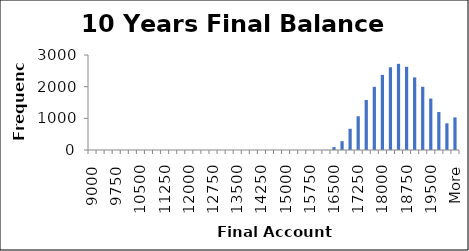
| Category | Frequency |
|---|---|
| 9000.0 | 0 |
| 9250.0 | 0 |
| 9500.0 | 0 |
| 9750.0 | 0 |
| 10000.0 | 0 |
| 10250.0 | 0 |
| 10500.0 | 0 |
| 10750.0 | 0 |
| 11000.0 | 0 |
| 11250.0 | 0 |
| 11500.0 | 0 |
| 11750.0 | 0 |
| 12000.0 | 0 |
| 12250.0 | 0 |
| 12500.0 | 0 |
| 12750.0 | 0 |
| 13000.0 | 0 |
| 13250.0 | 0 |
| 13500.0 | 0 |
| 13750.0 | 0 |
| 14000.0 | 0 |
| 14250.0 | 0 |
| 14500.0 | 0 |
| 14750.0 | 0 |
| 15000.0 | 0 |
| 15250.0 | 0 |
| 15500.0 | 0 |
| 15750.0 | 0 |
| 16000.0 | 0 |
| 16250.0 | 7 |
| 16500.0 | 90 |
| 16750.0 | 277 |
| 17000.0 | 670 |
| 17250.0 | 1065 |
| 17500.0 | 1580 |
| 17750.0 | 1995 |
| 18000.0 | 2371 |
| 18250.0 | 2613 |
| 18500.0 | 2720 |
| 18750.0 | 2628 |
| 19000.0 | 2292 |
| 19250.0 | 1998 |
| 19500.0 | 1623 |
| 19750.0 | 1199 |
| 20000.0 | 842 |
| More | 1030 |